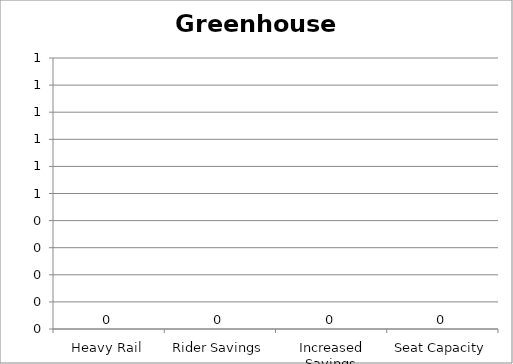
| Category | Greenhouse Gas |
|---|---|
| Heavy Rail | 0 |
| Rider Savings | 0 |
| Increased Savings | 0 |
| Seat Capacity | 0 |